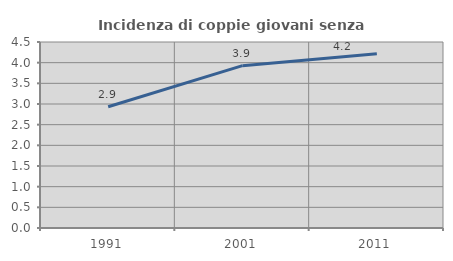
| Category | Incidenza di coppie giovani senza figli |
|---|---|
| 1991.0 | 2.933 |
| 2001.0 | 3.927 |
| 2011.0 | 4.215 |